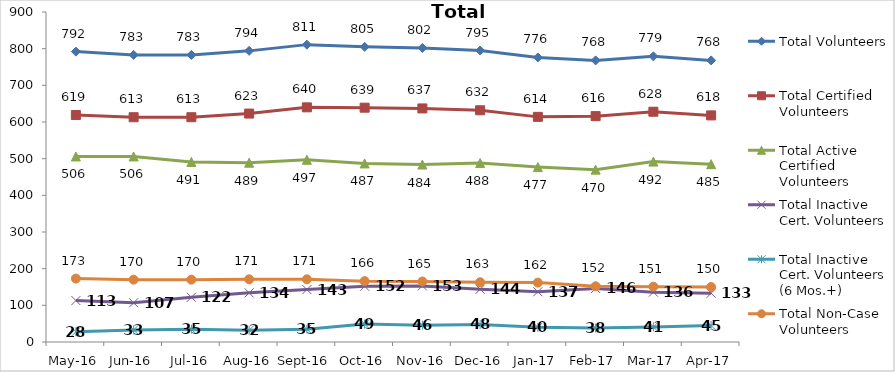
| Category | Total Volunteers | Total Certified Volunteers | Total Active Certified Volunteers | Total Inactive Cert. Volunteers | Total Inactive Cert. Volunteers (6 Mos.+) | Total Non-Case Volunteers |
|---|---|---|---|---|---|---|
| May-16 | 792 | 619 | 506 | 113 | 28 | 173 |
| Jun-16 | 783 | 613 | 506 | 107 | 33 | 170 |
| Jul-16 | 783 | 613 | 491 | 122 | 35 | 170 |
| Aug-16 | 794 | 623 | 489 | 134 | 32 | 171 |
| Sep-16 | 811 | 640 | 497 | 143 | 35 | 171 |
| Oct-16 | 805 | 639 | 487 | 152 | 49 | 166 |
| Nov-16 | 802 | 637 | 484 | 153 | 46 | 165 |
| Dec-16 | 795 | 632 | 488 | 144 | 48 | 163 |
| Jan-17 | 776 | 614 | 477 | 137 | 40 | 162 |
| Feb-17 | 768 | 616 | 470 | 146 | 38 | 152 |
| Mar-17 | 779 | 628 | 492 | 136 | 41 | 151 |
| Apr-17 | 768 | 618 | 485 | 133 | 45 | 150 |